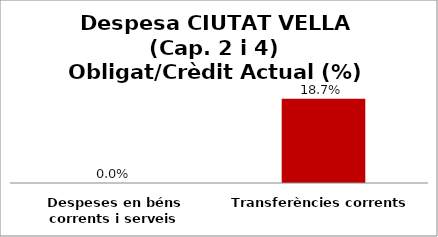
| Category | Series 0 |
|---|---|
| Despeses en béns corrents i serveis | 0 |
| Transferències corrents | 0.187 |